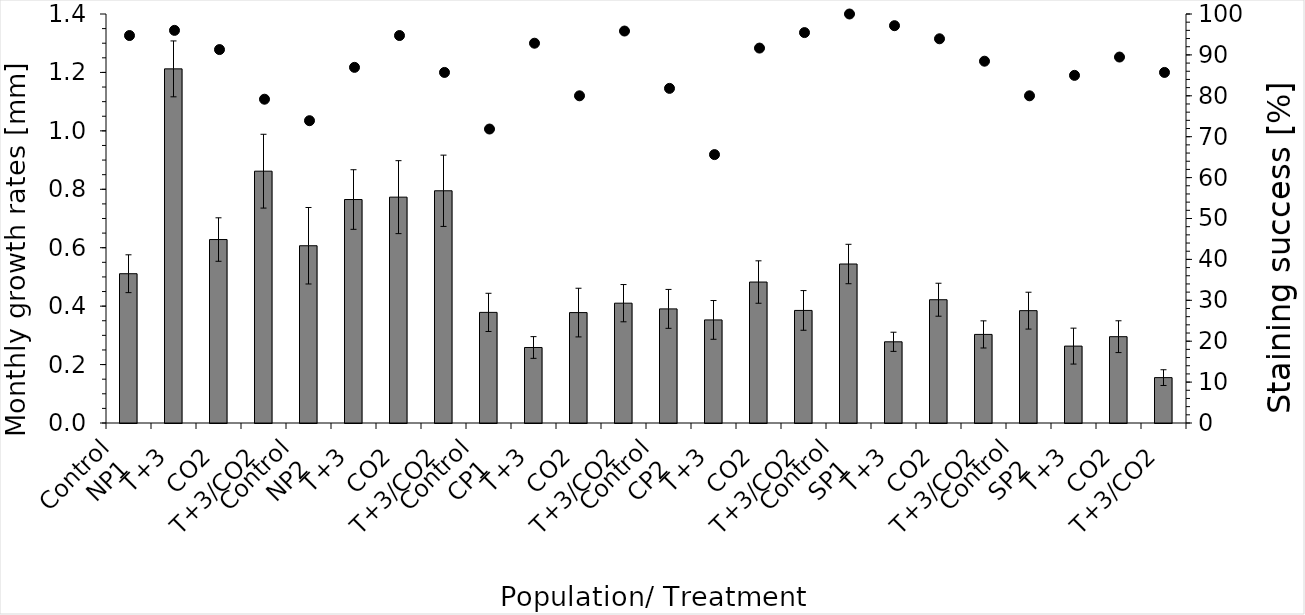
| Category | monthlyGrowth |
|---|---|
| 0 | 0.511 |
| 1 | 1.212 |
| 2 | 0.628 |
| 3 | 0.862 |
| 4 | 0.607 |
| 5 | 0.765 |
| 6 | 0.773 |
| 7 | 0.795 |
| 8 | 0.379 |
| 9 | 0.258 |
| 10 | 0.378 |
| 11 | 0.41 |
| 12 | 0.391 |
| 13 | 0.353 |
| 14 | 0.483 |
| 15 | 0.385 |
| 16 | 0.544 |
| 17 | 0.278 |
| 18 | 0.422 |
| 19 | 0.303 |
| 20 | 0.385 |
| 21 | 0.263 |
| 22 | 0.295 |
| 23 | 0.155 |